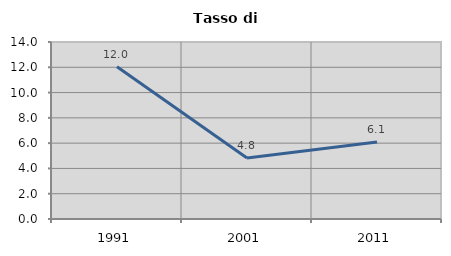
| Category | Tasso di disoccupazione   |
|---|---|
| 1991.0 | 12.044 |
| 2001.0 | 4.821 |
| 2011.0 | 6.087 |